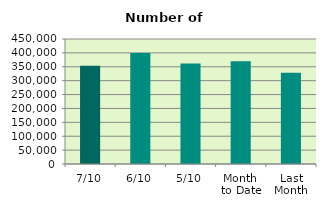
| Category | Series 0 |
|---|---|
| 7/10 | 353606 |
| 6/10 | 400012 |
| 5/10 | 361896 |
| Month 
to Date | 370134.4 |
| Last
Month | 328669.364 |